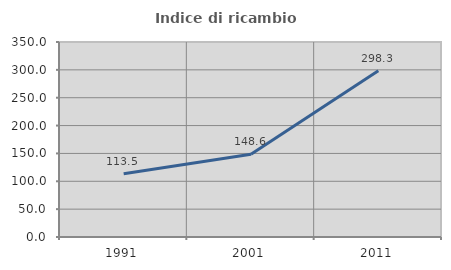
| Category | Indice di ricambio occupazionale  |
|---|---|
| 1991.0 | 113.539 |
| 2001.0 | 148.628 |
| 2011.0 | 298.311 |